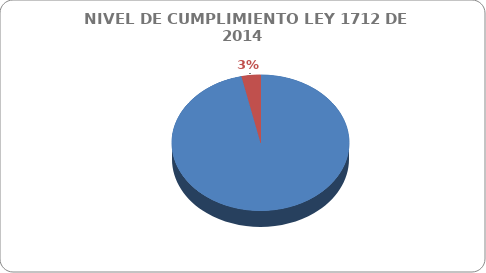
| Category | Series 0 |
|---|---|
|  CUMPLIDOS | 112 |
| NO CUMPLIDOS | 4 |